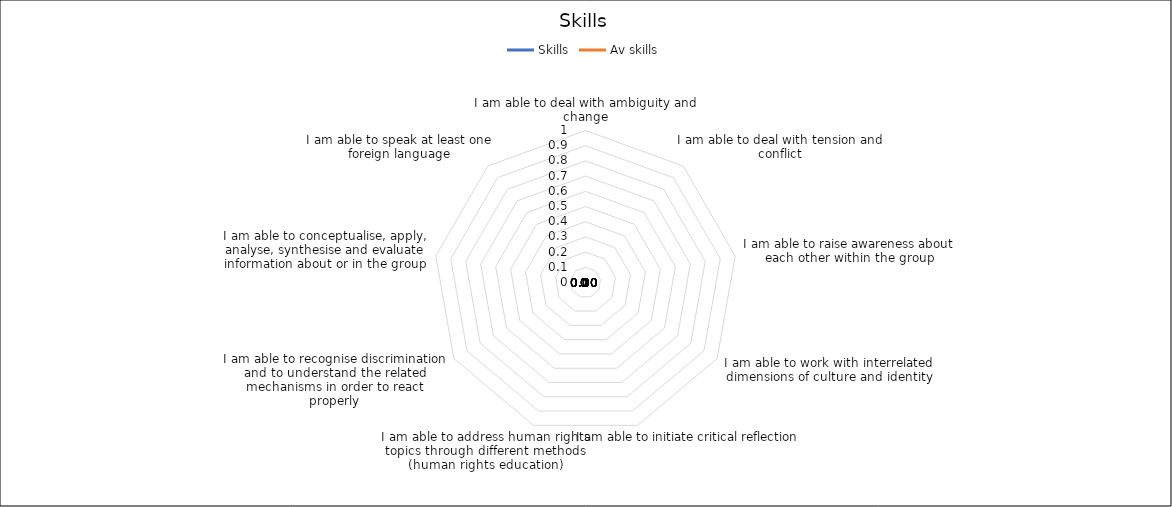
| Category | Skills | Av skills |
|---|---|---|
| I am able to deal with ambiguity and change | 0 | 0 |
| I am able to deal with tension and conflict | 0 | 0 |
| I am able to raise awareness about each other within the group | 0 | 0 |
| I am able to work with interrelated dimensions of culture and identity | 0 | 0 |
| I am able to initiate critical reflection | 0 | 0 |
| I am able to address human rights topics through different methods (human rights education) | 0 | 0 |
| I am able to recognise discrimination and to understand the related mechanisms in order to react properly | 0 | 0 |
| I am able to conceptualise, apply, analyse, synthesise and evaluate information about or in the group | 0 | 0 |
| I am able to speak at least one foreign language | 0 | 0 |